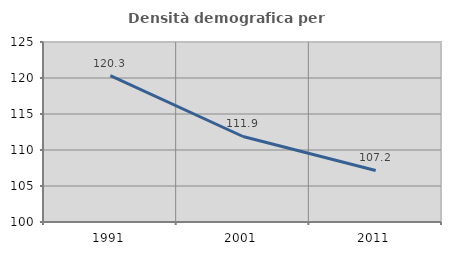
| Category | Densità demografica |
|---|---|
| 1991.0 | 120.34 |
| 2001.0 | 111.877 |
| 2011.0 | 107.161 |